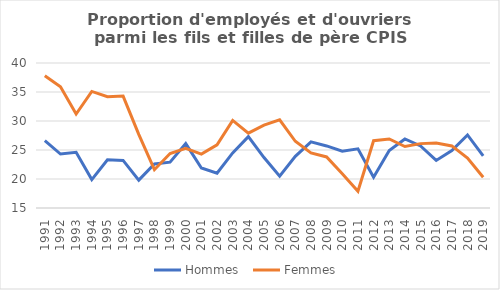
| Category | Hommes  | Femmes  |
|---|---|---|
| 1991.0 | 26.6 | 37.8 |
| 1992.0 | 24.3 | 35.9 |
| 1993.0 | 24.6 | 31.2 |
| 1994.0 | 19.9 | 35.1 |
| 1995.0 | 23.3 | 34.2 |
| 1996.0 | 23.2 | 34.3 |
| 1997.0 | 19.8 | 27.7 |
| 1998.0 | 22.6 | 21.6 |
| 1999.0 | 22.9 | 24.4 |
| 2000.0 | 26.1 | 25.3 |
| 2001.0 | 21.9 | 24.3 |
| 2002.0 | 21 | 25.9 |
| 2003.0 | 24.5 | 30.1 |
| 2004.0 | 27.3 | 27.9 |
| 2005.0 | 23.7 | 29.3 |
| 2006.0 | 20.5 | 30.2 |
| 2007.0 | 23.9 | 26.5 |
| 2008.0 | 26.4 | 24.5 |
| 2009.0 | 25.7 | 23.8 |
| 2010.0 | 24.8 | 20.9 |
| 2011.0 | 25.2 | 17.9 |
| 2012.0 | 20.3 | 26.6 |
| 2013.0 | 24.9 | 26.9 |
| 2014.0 | 26.9 | 25.6 |
| 2015.0 | 25.7 | 26.1 |
| 2016.0 | 23.2 | 26.2 |
| 2017.0 | 24.9 | 25.7 |
| 2018.0 | 27.6 | 23.6 |
| 2019.0 | 24 | 20.3 |